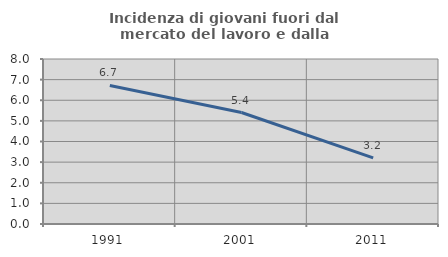
| Category | Incidenza di giovani fuori dal mercato del lavoro e dalla formazione  |
|---|---|
| 1991.0 | 6.719 |
| 2001.0 | 5.405 |
| 2011.0 | 3.209 |